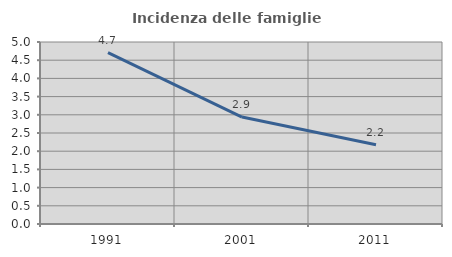
| Category | Incidenza delle famiglie numerose |
|---|---|
| 1991.0 | 4.709 |
| 2001.0 | 2.938 |
| 2011.0 | 2.178 |